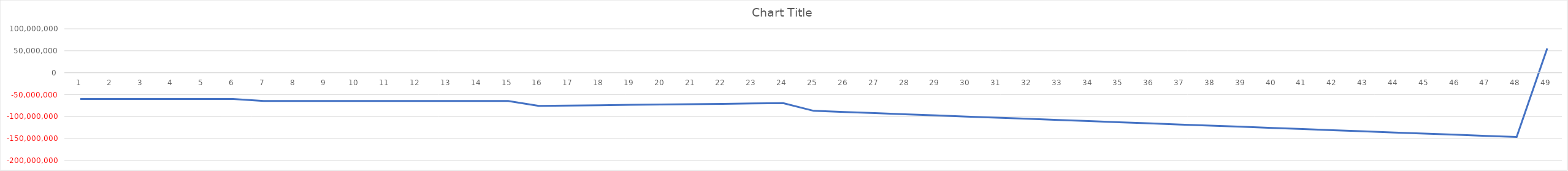
| Category | Series 0 |
|---|---|
| 0 | -59787424.189 |
| 1 | -59787424.189 |
| 2 | -59787424.189 |
| 3 | -59787424.189 |
| 4 | -59787424.189 |
| 5 | -59787424.189 |
| 6 | -64363723.965 |
| 7 | -64363723.965 |
| 8 | -64363723.965 |
| 9 | -64363723.965 |
| 10 | -64363723.965 |
| 11 | -64363723.965 |
| 12 | -64363723.965 |
| 13 | -64363723.965 |
| 14 | -64363723.965 |
| 15 | -75563723.965 |
| 16 | -74763723.965 |
| 17 | -73963723.965 |
| 18 | -73163723.965 |
| 19 | -72363723.965 |
| 20 | -71563723.965 |
| 21 | -70763723.965 |
| 22 | -69963723.965 |
| 23 | -69163723.965 |
| 24 | -86755702.899 |
| 25 | -89347681.832 |
| 26 | -91939660.765 |
| 27 | -94531639.699 |
| 28 | -97123618.632 |
| 29 | -99715597.565 |
| 30 | -102307576.499 |
| 31 | -104899555.432 |
| 32 | -107491534.365 |
| 33 | -110083513.299 |
| 34 | -112675492.232 |
| 35 | -115267471.165 |
| 36 | -117859450.099 |
| 37 | -120451429.032 |
| 38 | -123043407.965 |
| 39 | -125635386.899 |
| 40 | -128227365.832 |
| 41 | -130819344.765 |
| 42 | -133411323.699 |
| 43 | -136003302.632 |
| 44 | -138595281.565 |
| 45 | -141187260.499 |
| 46 | -143779239.432 |
| 47 | -146371218.365 |
| 48 | 55228781.635 |